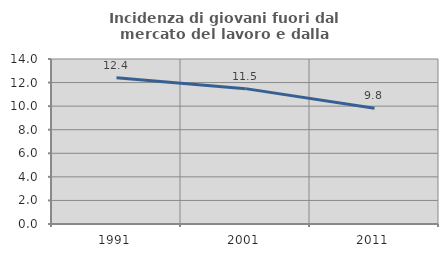
| Category | Incidenza di giovani fuori dal mercato del lavoro e dalla formazione  |
|---|---|
| 1991.0 | 12.411 |
| 2001.0 | 11.485 |
| 2011.0 | 9.819 |